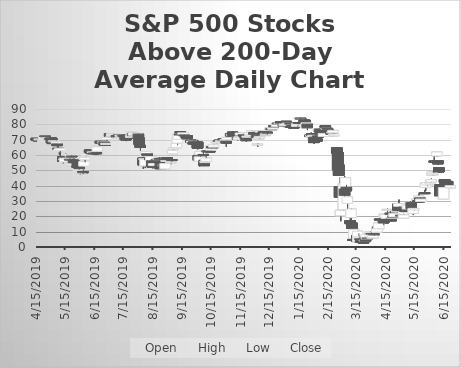
| Category | Open | High | Low | Close |
|---|---|---|---|---|
| 4/15/19 | 70.89 | 70.89 | 68.91 | 69.7 |
| 4/16/19 | 70.49 | 70.89 | 69.3 | 70.29 |
| 4/17/19 | 69.9 | 70.29 | 69.3 | 69.7 |
| 4/18/19 | 70.09 | 71.28 | 68.91 | 70.49 |
| 4/22/19 | 68.71 | 69.7 | 68.71 | 69.5 |
| 4/23/19 | 70.29 | 72.87 | 70.29 | 72.47 |
| 4/24/19 | 72.47 | 72.67 | 71.68 | 71.88 |
| 4/25/19 | 70.09 | 71.68 | 68.51 | 70.89 |
| 4/26/19 | 70.09 | 70.89 | 69.7 | 70.69 |
| 4/29/19 | 70.69 | 71.88 | 70.29 | 70.29 |
| 4/30/19 | 71.08 | 71.08 | 70.09 | 70.89 |
| 5/1/19 | 71.08 | 71.08 | 68.11 | 68.11 |
| 5/2/19 | 68.11 | 68.51 | 66.93 | 67.92 |
| 5/3/19 | 69.1 | 69.9 | 68.71 | 69.3 |
| 5/6/19 | 67.72 | 69.3 | 67.12 | 68.71 |
| 5/7/19 | 67.12 | 67.12 | 64.35 | 66.13 |
| 5/8/19 | 64.35 | 65.74 | 63.76 | 63.76 |
| 5/9/19 | 62.17 | 63.96 | 60.39 | 63.96 |
| 5/10/19 | 62.97 | 64.35 | 59.2 | 64.35 |
| 5/13/19 | 58.81 | 59 | 54.65 | 55.84 |
| 5/14/19 | 56.83 | 59.2 | 56.63 | 57.42 |
| 5/15/19 | 55.44 | 58.61 | 55.44 | 58.21 |
| 5/16/19 | 59 | 60.79 | 58.81 | 59 |
| 5/17/19 | 57.62 | 60.59 | 57.42 | 58.01 |
| 5/20/19 | 57.22 | 58.41 | 55.44 | 57.02 |
| 5/21/19 | 58.81 | 60.59 | 58.81 | 60.39 |
| 5/22/19 | 59.4 | 59.8 | 58.21 | 58.81 |
| 5/23/19 | 53.46 | 55.04 | 52.47 | 54.85 |
| 5/24/19 | 56.63 | 56.63 | 54.05 | 54.85 |
| 5/28/19 | 55.44 | 56.83 | 51.88 | 51.88 |
| 5/29/19 | 50.09 | 51.88 | 49.3 | 50.89 |
| 5/30/19 | 52.07 | 52.47 | 50.49 | 51.08 |
| 5/31/19 | 48.11 | 49.7 | 47.12 | 48.31 |
| 6/3/19 | 49.1 | 50.69 | 47.52 | 49 |
| 6/4/19 | 52.77 | 55.75 | 51.58 | 55.75 |
| 6/5/19 | 56.94 | 58.53 | 55.15 | 58.53 |
| 6/6/19 | 59.12 | 59.92 | 58.53 | 59.32 |
| 6/7/19 | 59.92 | 61.9 | 59.72 | 60.91 |
| 6/10/19 | 63.29 | 63.29 | 61.3 | 61.7 |
| 6/11/19 | 62.3 | 62.89 | 60.91 | 61.11 |
| 6/12/19 | 62.3 | 62.3 | 60.31 | 60.71 |
| 6/13/19 | 61.5 | 62.3 | 61.5 | 62.1 |
| 6/14/19 | 61.3 | 61.5 | 60.71 | 61.11 |
| 6/17/19 | 61.5 | 62.1 | 61.11 | 61.11 |
| 6/18/19 | 62.5 | 66.07 | 62.5 | 65.27 |
| 6/19/19 | 66.07 | 67.26 | 65.67 | 66.26 |
| 6/20/19 | 68.65 | 69.44 | 66.26 | 69.04 |
| 6/21/19 | 69.04 | 69.24 | 67.65 | 67.85 |
| 6/24/19 | 67.85 | 69.04 | 67.85 | 68.65 |
| 6/25/19 | 68.45 | 68.45 | 66.86 | 67.65 |
| 6/26/19 | 67.85 | 67.85 | 65.87 | 66.26 |
| 6/27/19 | 66.86 | 68.25 | 66.86 | 67.65 |
| 6/28/19 | 70.03 | 71.82 | 69.04 | 71.42 |
| 7/1/19 | 74 | 74 | 71.42 | 72.22 |
| 7/2/19 | 71.82 | 72.42 | 71.23 | 71.91 |
| 7/3/19 | 72.5 | 73.9 | 72.5 | 73.9 |
| 7/5/19 | 73.5 | 73.7 | 71.71 | 73.7 |
| 7/8/19 | 72.7 | 73.3 | 71.31 | 71.71 |
| 7/9/19 | 71.31 | 71.71 | 70.71 | 71.51 |
| 7/10/19 | 73.1 | 73.1 | 70.91 | 71.45 |
| 7/11/19 | 71.25 | 71.85 | 70.25 | 71.45 |
| 7/12/19 | 72.25 | 73.05 | 72.05 | 72.85 |
| 7/15/19 | 72.85 | 73.45 | 72.25 | 72.45 |
| 7/16/19 | 72.65 | 73.65 | 72.45 | 72.45 |
| 7/17/19 | 71.65 | 72.45 | 70.85 | 70.85 |
| 7/18/19 | 70.45 | 71.05 | 69.06 | 70.45 |
| 7/19/19 | 72.65 | 73.05 | 71.05 | 71.05 |
| 7/22/19 | 71.45 | 71.65 | 70.65 | 71.05 |
| 7/23/19 | 71.45 | 72.85 | 71.45 | 72.85 |
| 7/24/19 | 72.05 | 75.24 | 72.05 | 75.24 |
| 7/25/19 | 74.25 | 74.45 | 72.25 | 72.65 |
| 7/26/19 | 72.85 | 74.65 | 72.85 | 74.45 |
| 7/29/19 | 73.65 | 73.86 | 72.85 | 73.86 |
| 7/30/19 | 72.07 | 73.86 | 71.28 | 73.86 |
| 7/31/19 | 73.66 | 74.05 | 70.69 | 71.08 |
| 8/1/19 | 71.08 | 72.67 | 66.53 | 66.73 |
| 8/2/19 | 66.33 | 66.33 | 62.97 | 64.95 |
| 8/5/19 | 58.01 | 58.81 | 51.08 | 53.46 |
| 8/6/19 | 57.02 | 57.62 | 53.46 | 57.62 |
| 8/7/19 | 52.87 | 58.41 | 51.48 | 57.22 |
| 8/8/19 | 59.4 | 62.37 | 58.81 | 62.17 |
| 8/9/19 | 60.79 | 60.79 | 57.82 | 59.72 |
| 8/12/19 | 57.93 | 58.13 | 55.35 | 56.85 |
| 8/13/19 | 55.86 | 60.63 | 55.86 | 59 |
| 8/14/19 | 56.23 | 56.23 | 51.88 | 52.47 |
| 8/15/19 | 52.67 | 53.06 | 51.28 | 52.07 |
| 8/16/19 | 53.06 | 55.24 | 53.06 | 54.45 |
| 8/19/19 | 57.22 | 57.82 | 56.63 | 57.22 |
| 8/20/19 | 55.84 | 57.02 | 55.64 | 55.64 |
| 8/21/19 | 57.42 | 57.82 | 57.02 | 57.62 |
| 8/22/19 | 57.82 | 58.41 | 56.43 | 57.42 |
| 8/23/19 | 55.64 | 57.22 | 50.69 | 51.08 |
| 8/26/19 | 53.46 | 53.66 | 52.07 | 53.66 |
| 8/27/19 | 54.25 | 54.25 | 52.07 | 52.47 |
| 8/28/19 | 50.89 | 54.45 | 50.89 | 54.45 |
| 8/29/19 | 56.23 | 57.42 | 55.44 | 56.43 |
| 8/30/19 | 58.21 | 58.21 | 56.63 | 57.02 |
| 9/3/19 | 55.04 | 55.64 | 54.05 | 55.44 |
| 9/4/19 | 57.02 | 57.02 | 55.64 | 56.63 |
| 9/5/19 | 60.79 | 64.95 | 60.79 | 62.97 |
| 9/6/19 | 63.76 | 65.34 | 63.16 | 64.55 |
| 9/9/19 | 64.75 | 67.72 | 64.75 | 67.52 |
| 9/10/19 | 67.72 | 71.08 | 66.33 | 71.08 |
| 9/11/19 | 70.29 | 73.66 | 70.29 | 73.66 |
| 9/12/19 | 73.66 | 74.25 | 72.67 | 73.26 |
| 9/13/19 | 75.24 | 75.44 | 74.25 | 75.04 |
| 9/16/19 | 73.46 | 74.65 | 73.06 | 74.45 |
| 9/17/19 | 73.06 | 73.26 | 70.49 | 72.87 |
| 9/18/19 | 71.28 | 71.88 | 69.5 | 71.88 |
| 9/19/19 | 72.67 | 72.67 | 70.49 | 71.42 |
| 9/20/19 | 72.61 | 72.61 | 70.43 | 70.43 |
| 9/23/19 | 69.24 | 70.43 | 68.45 | 69.84 |
| 9/24/19 | 69.84 | 70.43 | 67.06 | 68.25 |
| 9/25/19 | 67.65 | 69.24 | 66.86 | 69.04 |
| 9/26/19 | 68.05 | 68.25 | 66.26 | 67.46 |
| 9/27/19 | 68.65 | 70.03 | 65.87 | 67.26 |
| 9/30/19 | 68.05 | 68.84 | 66.86 | 67.26 |
| 10/1/19 | 68.45 | 69.84 | 63.69 | 64.48 |
| 10/2/19 | 59.72 | 59.72 | 54.36 | 56.54 |
| 10/3/19 | 55.95 | 58.81 | 52.67 | 58.81 |
| 10/4/19 | 60.19 | 62.37 | 58.81 | 62.37 |
| 10/7/19 | 60.39 | 62.57 | 59.6 | 59.8 |
| 10/8/19 | 56.63 | 56.63 | 53.06 | 53.06 |
| 10/9/19 | 55.04 | 56.43 | 54.85 | 55.84 |
| 10/10/19 | 55.84 | 59.6 | 55.84 | 58.01 |
| 10/11/19 | 62.57 | 64.75 | 62.57 | 62.57 |
| 10/14/19 | 62.57 | 62.77 | 61.78 | 62.17 |
| 10/15/19 | 63.16 | 66.33 | 62.77 | 65.94 |
| 10/16/19 | 65.54 | 66.33 | 64.55 | 64.55 |
| 10/17/19 | 65.54 | 66.33 | 64.75 | 64.75 |
| 10/18/19 | 65.14 | 67.32 | 64.95 | 66.66 |
| 10/21/19 | 67.85 | 69.04 | 67.46 | 68.84 |
| 10/22/19 | 67.85 | 70.03 | 67.85 | 69.24 |
| 10/23/19 | 69.44 | 70.03 | 68.84 | 69.24 |
| 10/24/19 | 69.64 | 69.84 | 68.65 | 69.24 |
| 10/25/19 | 68.84 | 70.03 | 68.25 | 69.3 |
| 10/28/19 | 70.49 | 71.08 | 69.9 | 70.29 |
| 10/29/19 | 70.29 | 71.28 | 69.9 | 70.09 |
| 10/30/19 | 69.5 | 70.69 | 67.52 | 70.09 |
| 10/31/19 | 69.1 | 69.1 | 65.34 | 67.72 |
| 11/1/19 | 69.9 | 71.68 | 69.5 | 71.48 |
| 11/4/19 | 72.67 | 74.05 | 72.67 | 73.86 |
| 11/5/19 | 74.05 | 74.25 | 72.07 | 72.36 |
| 11/6/19 | 72.96 | 73.55 | 72.36 | 73.35 |
| 11/7/19 | 74.95 | 75.54 | 71.96 | 72.56 |
| 11/8/19 | 72.76 | 72.76 | 71.57 | 72.16 |
| 11/11/19 | 70.77 | 72.16 | 70.77 | 71.57 |
| 11/12/19 | 71.57 | 72.36 | 69.38 | 70.17 |
| 11/13/19 | 69.98 | 72.56 | 69.98 | 71.37 |
| 11/14/19 | 71.57 | 72.16 | 71.17 | 71.96 |
| 11/15/19 | 72.96 | 74.35 | 72.56 | 74.35 |
| 11/18/19 | 73.16 | 73.75 | 72.16 | 72.96 |
| 11/19/19 | 72.76 | 73.35 | 71.37 | 72.76 |
| 11/20/19 | 72.16 | 73.16 | 69.18 | 70.77 |
| 11/21/19 | 70.37 | 70.97 | 68.78 | 69.38 |
| 11/22/19 | 71.57 | 72.76 | 71.37 | 72.31 |
| 11/25/19 | 72.7 | 74.5 | 72.11 | 74.5 |
| 11/26/19 | 72.5 | 74.3 | 72.5 | 73.3 |
| 11/27/19 | 74.7 | 75.89 | 74.7 | 75.69 |
| 11/29/19 | 74.7 | 75.29 | 73.3 | 73.5 |
| 12/2/19 | 72.9 | 72.9 | 71.11 | 71.34 |
| 12/3/19 | 66.79 | 67.58 | 65.41 | 67.19 |
| 12/4/19 | 70.35 | 71.93 | 70.35 | 71.14 |
| 12/5/19 | 71.14 | 72.13 | 70.55 | 72.13 |
| 12/6/19 | 74.9 | 75.88 | 74.7 | 75.64 |
| 12/9/19 | 75.24 | 75.44 | 73.61 | 73.61 |
| 12/10/19 | 73.61 | 74.4 | 72.61 | 72.96 |
| 12/11/19 | 73.16 | 73.35 | 72.56 | 73.3 |
| 12/12/19 | 74.1 | 75.69 | 73.5 | 74.3 |
| 12/13/19 | 74.9 | 75.09 | 73.3 | 74.5 |
| 12/16/19 | 76.09 | 77.68 | 75.49 | 77.62 |
| 12/17/19 | 77.22 | 77.62 | 76.43 | 76.63 |
| 12/18/19 | 77.22 | 78.01 | 76.63 | 77.22 |
| 12/19/19 | 76.83 | 78.81 | 76.43 | 77.82 |
| 12/20/19 | 79 | 79.8 | 78.41 | 79 |
| 12/23/19 | 78.61 | 80.79 | 78.61 | 80.79 |
| 12/24/19 | 80.79 | 80.99 | 80 | 80.79 |
| 12/26/19 | 80.79 | 80.99 | 79.2 | 80.99 |
| 12/27/19 | 81.58 | 81.58 | 80.19 | 80.79 |
| 12/30/19 | 79.8 | 80.39 | 78.21 | 78.81 |
| 12/31/19 | 79 | 80.19 | 78.21 | 80.19 |
| 1/2/20 | 81.98 | 81.98 | 79 | 80.99 |
| 1/3/20 | 79.6 | 80.99 | 79.4 | 80.79 |
| 1/6/20 | 80.79 | 80.79 | 79.2 | 80.19 |
| 1/7/20 | 78.61 | 79.6 | 77.42 | 78.01 |
| 1/8/20 | 79.2 | 80.19 | 77.62 | 79.2 |
| 1/9/20 | 78.81 | 79.4 | 77.82 | 78.61 |
| 1/10/20 | 78.21 | 79 | 78.01 | 78.21 |
| 1/13/20 | 78.61 | 80.39 | 78.61 | 80.39 |
| 1/14/20 | 80 | 81.18 | 78.41 | 80.19 |
| 1/15/20 | 81.18 | 82.17 | 80 | 81.18 |
| 1/16/20 | 83.56 | 84.35 | 83.36 | 84.35 |
| 1/17/20 | 84.15 | 84.55 | 83.16 | 84.15 |
| 1/21/20 | 82.77 | 83.16 | 81.58 | 81.98 |
| 1/22/20 | 82.57 | 83.16 | 80.99 | 80.99 |
| 1/23/20 | 77.62 | 81.58 | 77.62 | 80.99 |
| 1/24/20 | 80.19 | 80.19 | 76.23 | 77.82 |
| 1/27/20 | 73.06 | 73.86 | 72.02 | 72.02 |
| 1/28/20 | 72.02 | 74.6 | 72.02 | 73.06 |
| 1/29/20 | 73.86 | 74.05 | 71.68 | 72.47 |
| 1/30/20 | 70.29 | 72.87 | 69.1 | 72.87 |
| 1/31/20 | 71.68 | 71.68 | 67.32 | 68.11 |
| 2/3/20 | 70.49 | 70.69 | 68.51 | 68.91 |
| 2/4/20 | 72.47 | 73.46 | 71.28 | 71.28 |
| 2/5/20 | 75.84 | 77.22 | 75.04 | 76.83 |
| 2/6/20 | 76.83 | 77.22 | 75.24 | 75.24 |
| 2/7/20 | 74.85 | 75.04 | 72.47 | 72.87 |
| 2/10/20 | 72.07 | 74.05 | 71.88 | 74.05 |
| 2/11/20 | 75.84 | 76.43 | 75.44 | 75.84 |
| 2/12/20 | 79 | 79 | 76.63 | 78.01 |
| 2/13/20 | 77.02 | 77.62 | 75.84 | 77.42 |
| 2/14/20 | 77.42 | 77.42 | 75.64 | 76.83 |
| 2/18/20 | 75.24 | 75.24 | 72.27 | 73.46 |
| 2/19/20 | 74.85 | 76.23 | 74.05 | 75.04 |
| 2/20/20 | 74.45 | 77.02 | 74.25 | 76.03 |
| 2/21/20 | 72.47 | 74.25 | 72.27 | 73.66 |
| 2/24/20 | 64.75 | 64.95 | 60.79 | 61.18 |
| 2/25/20 | 61.78 | 61.78 | 50.09 | 50.29 |
| 2/26/20 | 53.66 | 55.04 | 46.53 | 46.73 |
| 2/27/20 | 39.4 | 45.14 | 32.47 | 32.47 |
| 2/28/20 | 20.39 | 24.15 | 16.83 | 23.96 |
| 3/2/20 | 24.35 | 41.18 | 23.96 | 41.18 |
| 3/3/20 | 37.82 | 46.33 | 31.28 | 33.66 |
| 3/4/20 | 39.2 | 45.14 | 38.01 | 45.14 |
| 3/5/20 | 39 | 40.59 | 35.04 | 36.63 |
| 3/6/20 | 28.51 | 32.87 | 24.35 | 32.67 |
| 3/9/20 | 17.22 | 20.19 | 13.86 | 15.24 |
| 3/10/20 | 19.2 | 24.95 | 12.67 | 24.75 |
| 3/11/20 | 15.64 | 16.63 | 11.08 | 12.07 |
| 3/12/20 | 4.95 | 8.71 | 4.55 | 4.95 |
| 3/13/20 | 5.74 | 11.48 | 5.14 | 11.48 |
| 3/16/20 | 7.72 | 8.11 | 3.56 | 3.56 |
| 3/17/20 | 3.56 | 10.69 | 3.56 | 10.29 |
| 3/18/20 | 5.94 | 8.91 | 5.34 | 6.73 |
| 3/19/20 | 5.34 | 6.93 | 4.95 | 4.95 |
| 3/20/20 | 4.75 | 6.33 | 2.57 | 2.97 |
| 3/23/20 | 3.16 | 3.56 | 1.98 | 2.97 |
| 3/24/20 | 4.35 | 4.75 | 3.56 | 4.55 |
| 3/25/20 | 4.95 | 5.54 | 3.76 | 3.76 |
| 3/26/20 | 5.14 | 8.31 | 4.95 | 8.31 |
| 3/27/20 | 5.94 | 7.52 | 5.54 | 5.94 |
| 3/30/20 | 6.93 | 10.29 | 6.93 | 9.9 |
| 3/31/20 | 8.91 | 10.29 | 8.31 | 8.71 |
| 4/1/20 | 5.94 | 7.32 | 5.74 | 6.33 |
| 4/2/20 | 5.94 | 7.92 | 5.94 | 7.92 |
| 4/3/20 | 8.51 | 8.51 | 7.32 | 8.13 |
| 4/6/20 | 9.72 | 13.04 | 9.72 | 13.04 |
| 4/7/20 | 13.04 | 15.61 | 12.25 | 12.25 |
| 4/8/20 | 11.85 | 16.23 | 11.66 | 15.64 |
| 4/9/20 | 18.21 | 20.59 | 16.83 | 18.01 |
| 4/13/20 | 16.63 | 16.63 | 14.25 | 15.64 |
| 4/14/20 | 19.2 | 21.98 | 18.61 | 21.58 |
| 4/15/20 | 18.01 | 19 | 16.83 | 18.01 |
| 4/16/20 | 18.61 | 21.18 | 17.62 | 21.18 |
| 4/17/20 | 23.96 | 24.95 | 21.98 | 24.55 |
| 4/20/20 | 21.98 | 23.36 | 21.38 | 21.38 |
| 4/21/20 | 18.41 | 18.81 | 16.63 | 17.02 |
| 4/22/20 | 18.81 | 20 | 18.41 | 19.4 |
| 4/23/20 | 20.39 | 21.78 | 19 | 19.2 |
| 4/24/20 | 19.6 | 21.78 | 19 | 21.78 |
| 4/27/20 | 23.36 | 24.95 | 22.57 | 23.96 |
| 4/28/20 | 27.92 | 28.31 | 23.76 | 23.76 |
| 4/29/20 | 26.53 | 30.89 | 26.53 | 28.31 |
| 4/30/20 | 25.74 | 26.73 | 23.96 | 24.15 |
| 5/1/20 | 20.79 | 20.99 | 19.4 | 20.19 |
| 5/4/20 | 18.81 | 21.58 | 18.81 | 20.99 |
| 5/5/20 | 23.96 | 26.13 | 23.76 | 23.76 |
| 5/6/20 | 23.76 | 25.34 | 23.76 | 23.76 |
| 5/7/20 | 25.14 | 25.94 | 24.55 | 24.75 |
| 5/8/20 | 24.75 | 28.31 | 24.75 | 27.32 |
| 5/11/20 | 27.52 | 29.7 | 26.53 | 28.91 |
| 5/12/20 | 28.91 | 29.1 | 25 | 25 |
| 5/13/20 | 24.4 | 25.59 | 21.82 | 23.8 |
| 5/14/20 | 21.82 | 25 | 20.83 | 25 |
| 5/15/20 | 24.2 | 25.79 | 23.8 | 25.19 |
| 5/18/20 | 30.35 | 33.26 | 29.56 | 31.28 |
| 5/19/20 | 30.29 | 31.68 | 29.3 | 29.3 |
| 5/20/20 | 31.88 | 34.65 | 31.88 | 33.26 |
| 5/21/20 | 32.07 | 32.07 | 28.91 | 29.5 |
| 5/22/20 | 29.7 | 31.28 | 29.7 | 31.28 |
| 5/26/20 | 35.44 | 37.22 | 34.65 | 34.85 |
| 5/27/20 | 38.81 | 41.58 | 36.63 | 41.58 |
| 5/28/20 | 41.38 | 43.76 | 41.18 | 41.98 |
| 5/29/20 | 40.39 | 42.37 | 39.6 | 41.98 |
| 6/1/20 | 40.99 | 43.16 | 40.99 | 41.78 |
| 6/2/20 | 42.37 | 44.55 | 42.17 | 43.96 |
| 6/3/20 | 46.73 | 49.3 | 46.53 | 48.91 |
| 6/4/20 | 47.12 | 48.91 | 46.73 | 48.11 |
| 6/5/20 | 56.03 | 59.6 | 55.04 | 55.44 |
| 6/8/20 | 59.4 | 61.98 | 59 | 61.98 |
| 6/9/20 | 56.23 | 56.23 | 53.46 | 54.25 |
| 6/10/20 | 51.68 | 51.68 | 48.31 | 48.91 |
| 6/11/20 | 40.59 | 41.58 | 33.46 | 33.46 |
| 6/12/20 | 40.59 | 40.59 | 31.68 | 36.43 |
| 6/15/20 | 31.28 | 39.8 | 31.28 | 38.81 |
| 6/16/20 | 43.96 | 44.35 | 40.59 | 42.17 |
| 6/17/20 | 42.17 | 43.16 | 41.58 | 41.78 |
| 6/18/20 | 41.38 | 41.58 | 40.19 | 41.38 |
| 6/19/20 | 42.77 | 42.97 | 39.4 | 40 |
| 6/22/20 | 38.61 | 40.59 | 38.61 | 40 |